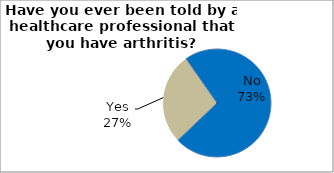
| Category | Series 0 |
|---|---|
| No | 72.611 |
| Yes | 27.389 |